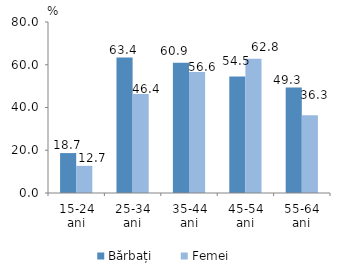
| Category | Bărbați | Femei |
|---|---|---|
| 15-24 ani | 18.678 | 12.706 |
| 25-34 ani | 63.382 | 46.36 |
| 35-44 ani | 60.902 | 56.613 |
| 45-54 ani | 54.469 | 62.836 |
| 55-64 ani | 49.332 | 36.343 |